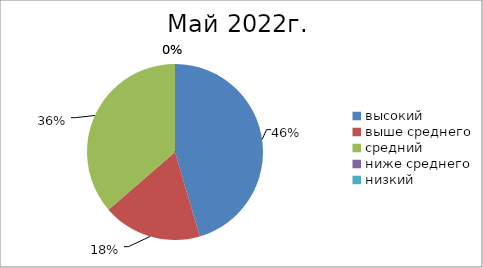
| Category | Series 0 |
|---|---|
| высокий | 5 |
| выше среднего | 2 |
| средний | 4 |
| ниже среднего | 0 |
| низкий | 0 |